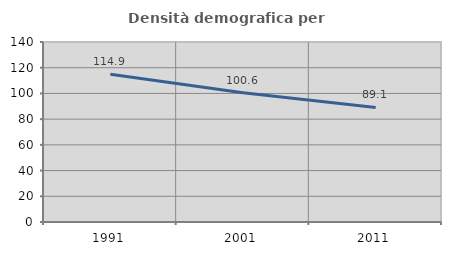
| Category | Densità demografica |
|---|---|
| 1991.0 | 114.915 |
| 2001.0 | 100.572 |
| 2011.0 | 89.108 |